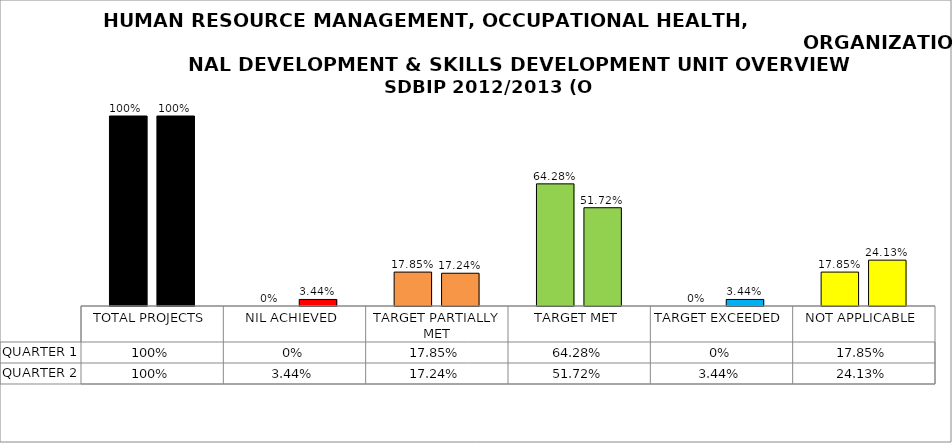
| Category | QUARTER 1 | QUARTER 2 |
|---|---|---|
| TOTAL PROJECTS | 1 | 1 |
| NIL ACHIEVED | 0 | 0.034 |
| TARGET PARTIALLY MET | 0.178 | 0.172 |
| TARGET MET | 0.643 | 0.517 |
| TARGET EXCEEDED | 0 | 0.034 |
| NOT APPLICABLE | 0.178 | 0.241 |